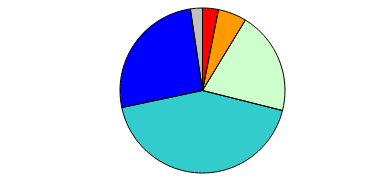
| Category | Series 0 |
|---|---|
| 0 | 21 |
| 1 | 38 |
| 2 | 137 |
| 3 | 290 |
| 4 | 176 |
| 5 | 16 |